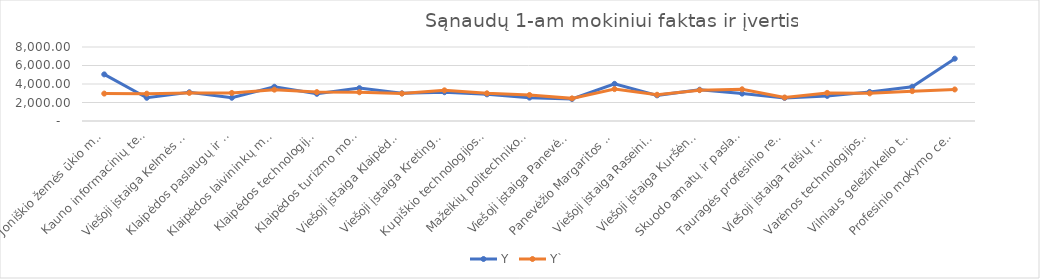
| Category | Y | Y` |
|---|---|---|
| Joniškio žemės ūkio mokykla | 5038.864 | 2963.132 |
| Kauno informacinių technologijų mokykla | 2508.663 | 2953.638 |
| Viešoji įstaiga Kelmės profesinio rengimo centras | 3107.805 | 3038.487 |
| Klaipėdos paslaugų ir verslo mokykla | 2514.129 | 3032.55 |
| Klaipėdos laivininkų mokykla | 3700.571 | 3387.623 |
| Klaipėdos technologijų mokymo centras | 2938.394 | 3123.85 |
| Klaipėdos turizmo mokykla | 3554.295 | 3108.081 |
| Viešoji įstaiga Klaipėdos laivų statybos ir remonto mokykla | 2991.769 | 2968.445 |
| Viešoji įstaiga Kretingos technologijos ir verslo mokykla | 3111.402 | 3314.678 |
| Kupiškio technologijos ir verslo mokykla | 2881.257 | 2992.752 |
| Mažeikių politechnikos mokykla | 2526.118 | 2811.089 |
| Viešoji įstaiga Panevėžio profesinio rengimo centras | 2381.801 | 2446.548 |
| Panevėžio Margaritos Rimkevičaitės profesinio rengimo centras | 4017.979 | 3447.524 |
| Viešoji įstaiga Raseinių technologijos ir verslo mokykla | 2772.113 | 2837.429 |
| Viešoji įstaiga Kuršėnų politechnikos mokykla | 3383.52 | 3334.069 |
| Skuodo amatų ir paslaugų mokykla | 2961.222 | 3428.53 |
| Tauragės profesinio rengimo centras | 2496.124 | 2537.037 |
| Viešoji įstaiga Telšių regioninis profesinio mokymo centras | 2714.065 | 3039.144 |
| Varėnos technologijos ir verslo mokykla | 3144.599 | 2987.015 |
| Vilniaus geležinkelio transporto ir verslo paslaugų mokykla | 3702.079 | 3229.325 |
| Profesinio mokymo centras "Žirmūnai" | 6739.148 | 3410.494 |